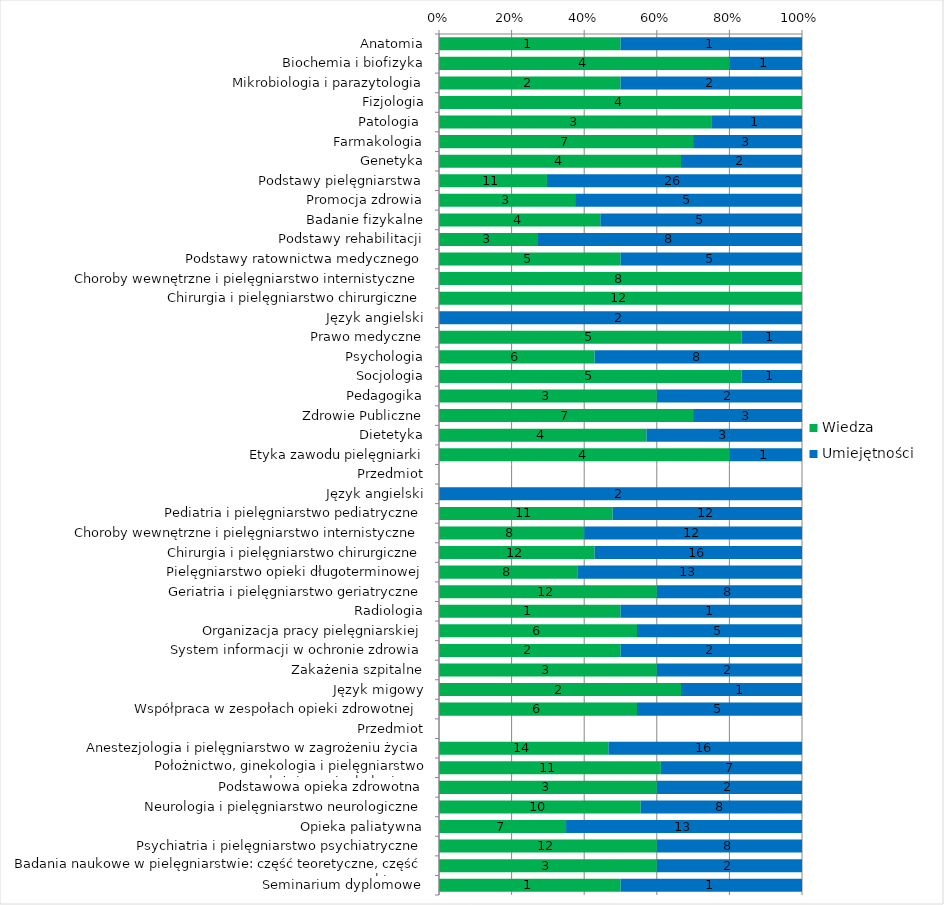
| Category | Wiedza | Umiejętności |
|---|---|---|
| Anatomia | 1 | 1 |
| Biochemia i biofizyka | 4 | 1 |
| Mikrobiologia i parazytologia | 2 | 2 |
| Fizjologia | 4 | 0 |
| Patologia  | 3 | 1 |
| Farmakologia | 7 | 3 |
| Genetyka | 4 | 2 |
| Podstawy pielęgniarstwa | 11 | 26 |
| Promocja zdrowia | 3 | 5 |
| Badanie fizykalne | 4 | 5 |
| Podstawy rehabilitacji | 3 | 8 |
| Podstawy ratownictwa medycznego | 5 | 5 |
| Choroby wewnętrzne i pielęgniarstwo internistyczne | 8 | 0 |
| Chirurgia i pielęgniarstwo chirurgiczne | 12 | 0 |
| Język angielski | 0 | 2 |
| Prawo medyczne | 5 | 1 |
| Psychologia | 6 | 8 |
| Socjologia | 5 | 1 |
| Pedagogika | 3 | 2 |
| Zdrowie Publiczne | 7 | 3 |
| Dietetyka | 4 | 3 |
| Etyka zawodu pielęgniarki | 4 | 1 |
| Przedmiot | 0 | 0 |
| Język angielski | 0 | 2 |
| Pediatria i pielęgniarstwo pediatryczne | 11 | 12 |
| Choroby wewnętrzne i pielęgniarstwo internistyczne | 8 | 12 |
| Chirurgia i pielęgniarstwo chirurgiczne | 12 | 16 |
| Pielęgniarstwo opieki długoterminowej | 8 | 13 |
| Geriatria i pielęgniarstwo geriatryczne | 12 | 8 |
| Radiologia | 1 | 1 |
| Organizacja pracy pielęgniarskiej | 6 | 5 |
| System informacji w ochronie zdrowia | 2 | 2 |
| Zakażenia szpitalne | 3 | 2 |
| Język migowy | 2 | 1 |
| Współpraca w zespołach opieki zdrowotnej  | 6 | 5 |
| Przedmiot | 0 | 0 |
| Anestezjologia i pielęgniarstwo w zagrożeniu życia | 14 | 16 |
| Położnictwo, ginekologia i pielęgniarstwo położniczo-ginekologiczne | 11 | 7 |
| Podstawowa opieka zdrowotna | 3 | 2 |
| Neurologia i pielęgniarstwo neurologiczne | 10 | 8 |
| Opieka paliatywna | 7 | 13 |
| Psychiatria i pielęgniarstwo psychiatryczne | 12 | 8 |
| Badania naukowe w pielęgniarstwie: część teoretyczne, część praktyczna | 3 | 2 |
| Seminarium dyplomowe | 1 | 1 |